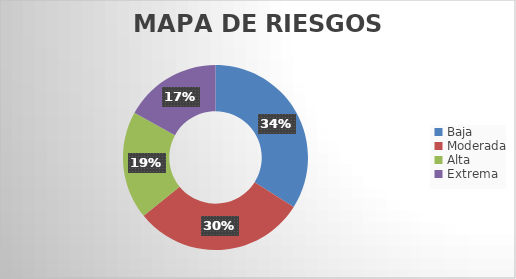
| Category | Series 0 |
|---|---|
| Baja | 0.34 |
| Moderada | 0.302 |
| Alta | 0.189 |
| Extrema | 0.17 |